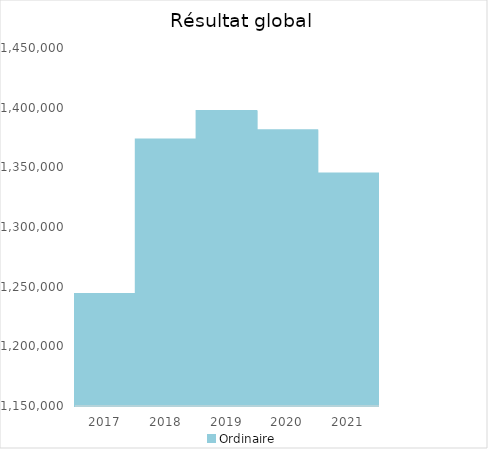
| Category |   | Ordinaire |    |
|---|---|---|---|
| 2017.0 |  | 1243793.39 |  |
| 2018.0 |  | 1373327.66 |  |
| 2019.0 |  | 1397260.84 |  |
| 2020.0 |  | 1381047.31 |  |
| 2021.0 |  | 1344936.6 |  |